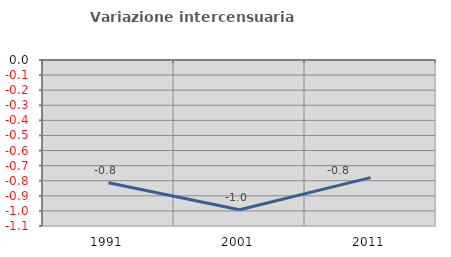
| Category | Variazione intercensuaria annua |
|---|---|
| 1991.0 | -0.814 |
| 2001.0 | -0.992 |
| 2011.0 | -0.779 |